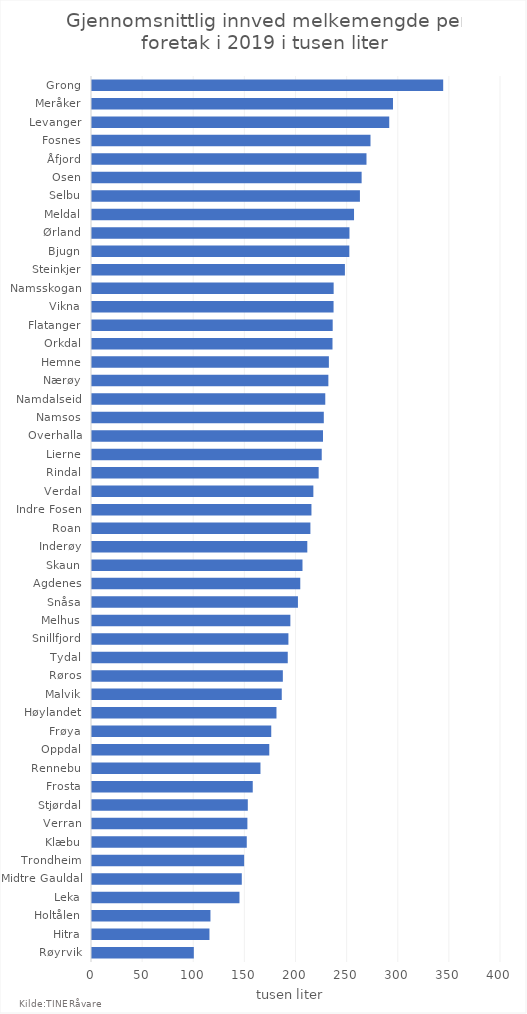
| Category | Totalt |
|---|---|
| Røyrvik | 99.585 |
| Hitra | 114.865 |
| Holtålen | 115.844 |
| Leka | 144.234 |
| Midtre Gauldal | 146.495 |
| Trondheim | 148.797 |
| Klæbu | 151.361 |
| Verran | 151.974 |
| Stjørdal | 152.378 |
| Frosta | 157.21 |
| Rennebu | 164.756 |
| Oppdal | 173.382 |
| Frøya | 175.298 |
| Høylandet | 180.415 |
| Malvik | 185.587 |
| Røros | 186.646 |
| Tydal | 191.443 |
| Snillfjord | 192.095 |
| Melhus | 193.999 |
| Snåsa | 201.4 |
| Agdenes | 203.694 |
| Skaun | 205.857 |
| Inderøy | 210.57 |
| Roan | 213.59 |
| Indre Fosen | 214.623 |
| Verdal | 216.487 |
| Rindal | 221.67 |
| Lierne | 224.676 |
| Overhalla | 225.916 |
| Namsos | 226.701 |
| Namdalseid | 228.138 |
| Nærøy | 231.162 |
| Hemne | 231.673 |
| Orkdal | 235.204 |
| Flatanger | 235.398 |
| Vikna | 236.247 |
| Namsskogan | 236.335 |
| Steinkjer | 247.348 |
| Bjugn | 251.668 |
| Ørland | 251.793 |
| Meldal | 256.258 |
| Selbu | 262.037 |
| Osen | 263.69 |
| Åfjord | 268.446 |
| Fosnes | 272.372 |
| Levanger | 290.698 |
| Meråker | 294.368 |
| Grong | 343.465 |